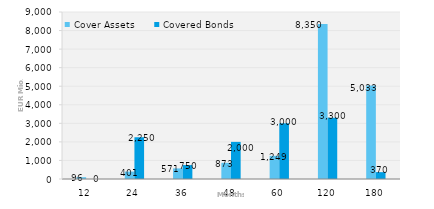
| Category | Cover Assets | Covered Bonds |
|---|---|---|
| 12.0 | 95.621 | 0 |
| 24.0 | 400.801 | 2250 |
| 36.0 | 571.177 | 750 |
| 48.0 | 872.593 | 2000 |
| 60.0 | 1248.85 | 3000 |
| 120.0 | 8349.71 | 3300 |
| 180.0 | 5032.841 | 370 |